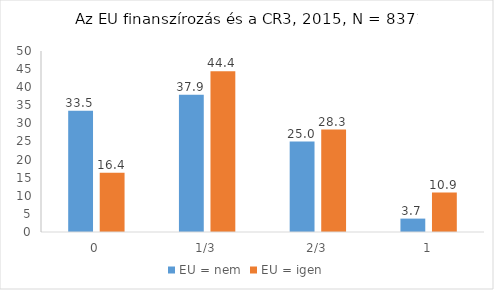
| Category | EU = nem | EU = igen |
|---|---|---|
| 0 | 33.5 | 16.4 |
| 1/3 | 37.9 | 44.4 |
| 2/3 | 25 | 28.3 |
| 1 | 3.7 | 10.9 |